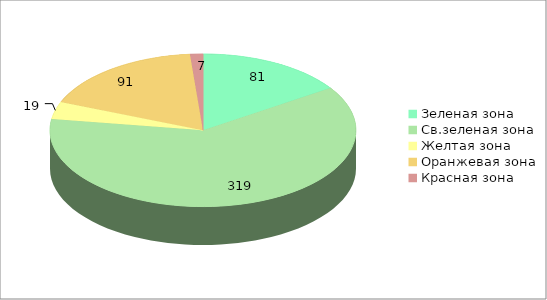
| Category | Series 0 | Series 1 |
|---|---|---|
| Зеленая зона | 81 | 0.157 |
| Св.зеленая зона | 319 | 0.617 |
| Желтая зона | 19 | 0.037 |
| Оранжевая зона | 91 | 0.176 |
| Красная зона | 7 | 0.014 |